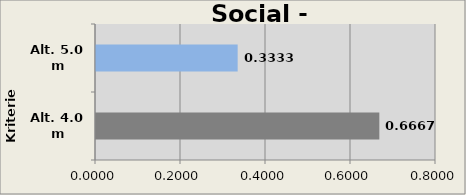
| Category | P. Acceptance |
|---|---|
| Alt. 4.0 m | 0.667 |
| Alt. 5.0 m | 0.333 |